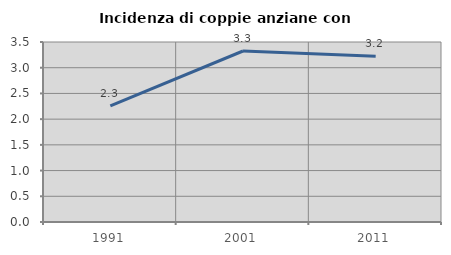
| Category | Incidenza di coppie anziane con figli |
|---|---|
| 1991.0 | 2.257 |
| 2001.0 | 3.325 |
| 2011.0 | 3.224 |